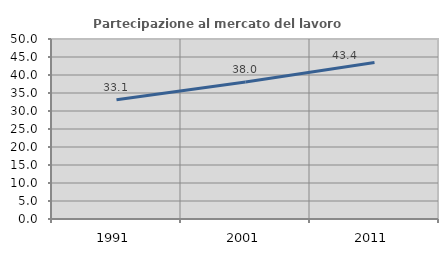
| Category | Partecipazione al mercato del lavoro  femminile |
|---|---|
| 1991.0 | 33.098 |
| 2001.0 | 38.038 |
| 2011.0 | 43.449 |